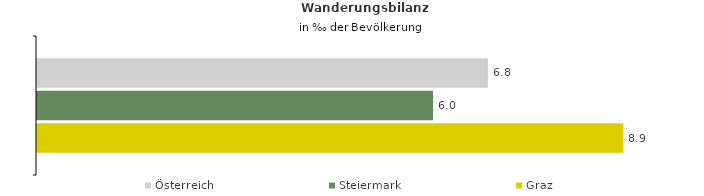
| Category | Österreich | Steiermark | Graz |
|---|---|---|---|
| Wanderungsrate in ‰ der Bevölkerung, Periode 2018-2022 | 6.822 | 5.992 | 8.87 |